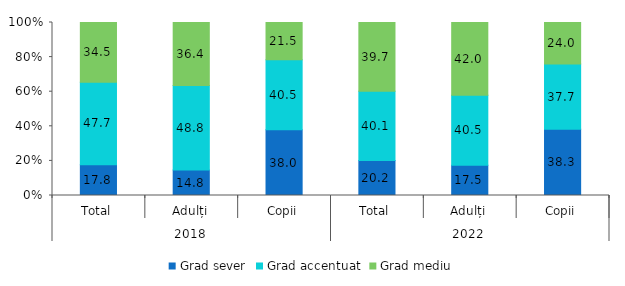
| Category | Grad sever | Grad accentuat | Grad mediu |
|---|---|---|---|
| 0 | 17.8 | 47.7 | 34.5 |
| 1 | 14.8 | 48.8 | 36.4 |
| 2 | 38 | 40.5 | 21.5 |
| 3 | 20.2 | 40.1 | 39.7 |
| 4 | 17.5 | 40.5 | 42 |
| 5 | 38.3 | 37.7 | 24 |